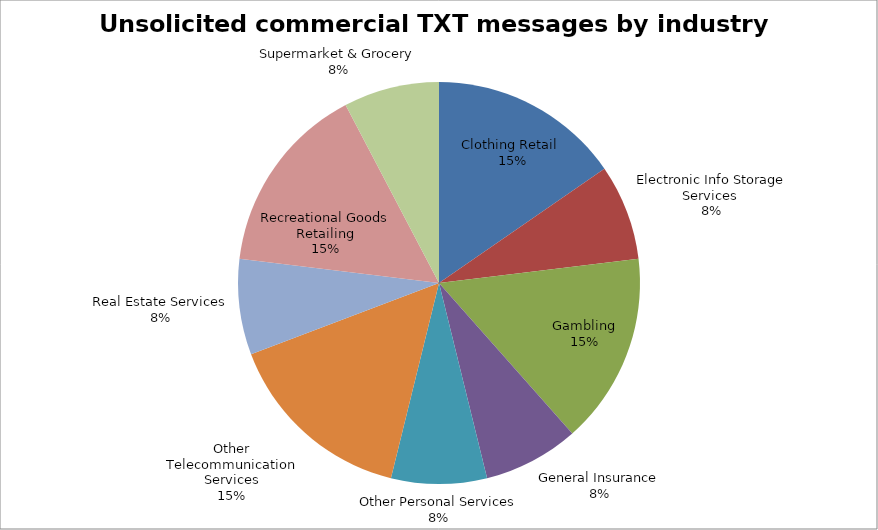
| Category | Series 0 |
|---|---|
| Clothing Retail  | 2 |
| Electronic Info Storage Services  | 1 |
| Gambling | 2 |
| General Insurance | 1 |
| Other Personal Services | 1 |
| Other Telecommunication Services | 2 |
| Real Estate Services | 1 |
| Recreational Goods Retailing | 2 |
| Supermarket & Grocery | 1 |